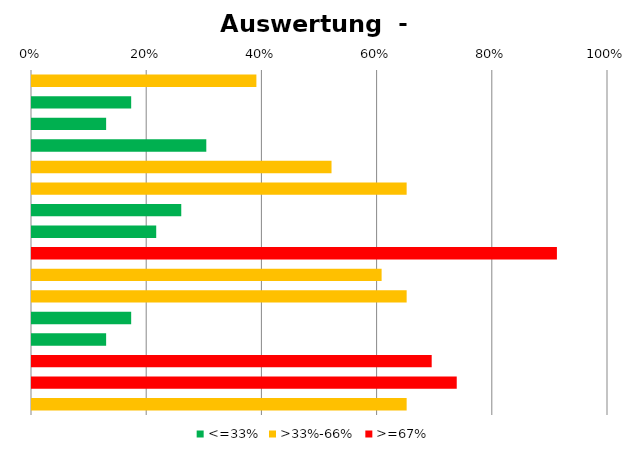
| Category | <=33% | >33%-66% | >=67% |
|---|---|---|---|
| Frage 1 | 0 | 0.391 | 0 |
| Frage 2 | 0.174 | 0 | 0 |
| Frage 3 | 0.13 | 0 | 0 |
| Frage 4 | 0.304 | 0 | 0 |
| Frage 5 | 0 | 0.522 | 0 |
| Frage 6 | 0 | 0.652 | 0 |
| Frage 7 | 0.261 | 0 | 0 |
| Frage 8 | 0.217 | 0 | 0 |
| Frage 9 | 0 | 0 | 0.913 |
| Frage 10 | 0 | 0.609 | 0 |
| Frage 11 | 0 | 0.652 | 0 |
| Frage 12 | 0.174 | 0 | 0 |
| Frage 13 | 0.13 | 0 | 0 |
| Frage 14 | 0 | 0 | 0.696 |
| Frage 15 | 0 | 0 | 0.739 |
| Frage 16 | 0 | 0.652 | 0 |